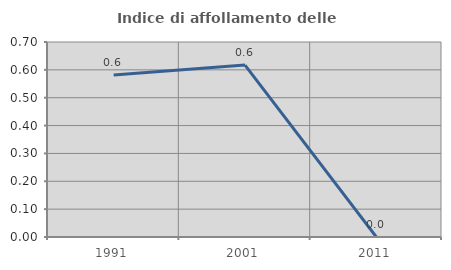
| Category | Indice di affollamento delle abitazioni  |
|---|---|
| 1991.0 | 0.581 |
| 2001.0 | 0.617 |
| 2011.0 | 0 |